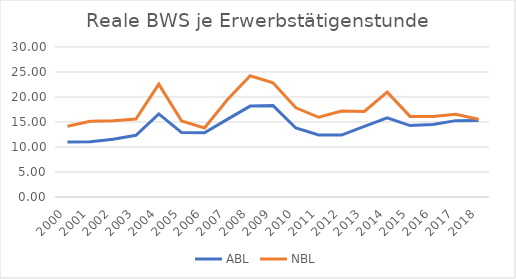
| Category | ABL | NBL |
|---|---|---|
| 2000.0 | 10.996 | 14.141 |
| 2001.0 | 11.069 | 15.133 |
| 2002.0 | 11.545 | 15.267 |
| 2003.0 | 12.351 | 15.592 |
| 2004.0 | 16.624 | 22.574 |
| 2005.0 | 12.884 | 15.217 |
| 2006.0 | 12.843 | 13.814 |
| 2007.0 | 15.528 | 19.435 |
| 2008.0 | 18.181 | 24.249 |
| 2009.0 | 18.275 | 22.837 |
| 2010.0 | 13.81 | 17.847 |
| 2011.0 | 12.393 | 15.947 |
| 2012.0 | 12.386 | 17.202 |
| 2013.0 | 14.122 | 17.118 |
| 2014.0 | 15.811 | 20.98 |
| 2015.0 | 14.278 | 16.12 |
| 2016.0 | 14.493 | 16.094 |
| 2017.0 | 15.272 | 16.565 |
| 2018.0 | 15.32 | 15.558 |